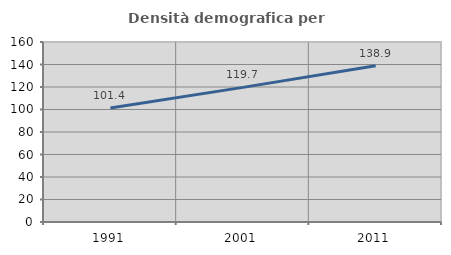
| Category | Densità demografica |
|---|---|
| 1991.0 | 101.417 |
| 2001.0 | 119.656 |
| 2011.0 | 138.897 |